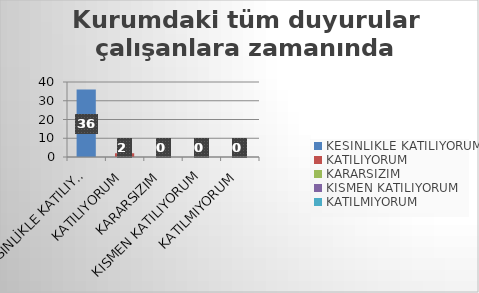
| Category | Kurumdaki tüm duyurular çalışanlara zamanında iletilir. |
|---|---|
| KESİNLİKLE KATILIYORUM | 36 |
| KATILIYORUM | 2 |
| KARARSIZIM | 0 |
| KISMEN KATILIYORUM | 0 |
| KATILMIYORUM | 0 |